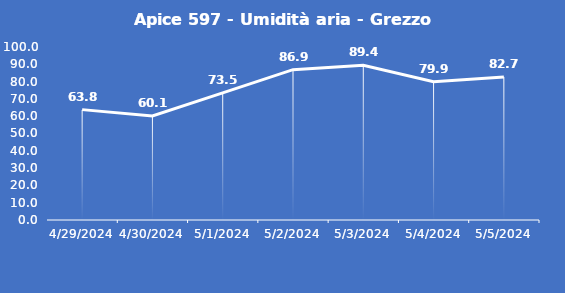
| Category | Apice 597 - Umidità aria - Grezzo (%) |
|---|---|
| 4/29/24 | 63.8 |
| 4/30/24 | 60.1 |
| 5/1/24 | 73.5 |
| 5/2/24 | 86.9 |
| 5/3/24 | 89.4 |
| 5/4/24 | 79.9 |
| 5/5/24 | 82.7 |